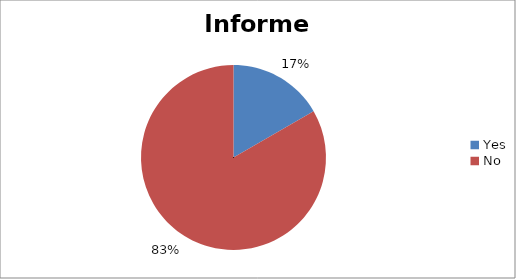
| Category | Informed |
|---|---|
| Yes | 1 |
| No | 5 |